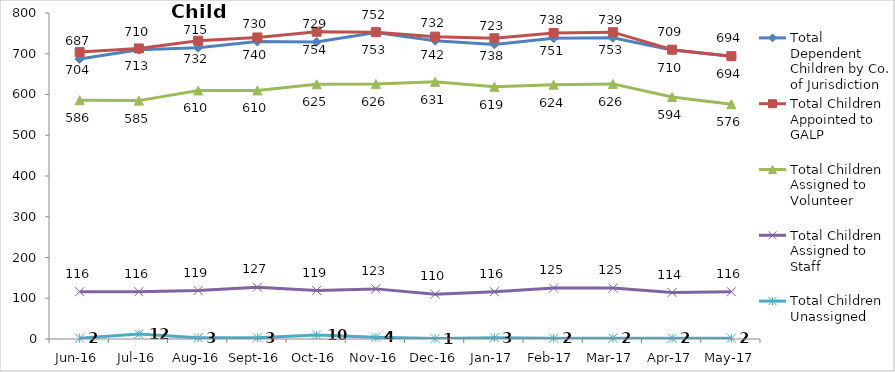
| Category | Total Dependent Children by Co. of Jurisdiction | Total Children Appointed to GALP | Total Children Assigned to Volunteer | Total Children Assigned to Staff | Total Children Unassigned |
|---|---|---|---|---|---|
| Jun-16 | 687 | 704 | 586 | 116 | 2 |
| Jul-16 | 710 | 713 | 585 | 116 | 12 |
| Aug-16 | 715 | 732 | 610 | 119 | 3 |
| Sep-16 | 730 | 740 | 610 | 127 | 3 |
| Oct-16 | 729 | 754 | 625 | 119 | 10 |
| Nov-16 | 752 | 753 | 626 | 123 | 4 |
| Dec-16 | 732 | 742 | 631 | 110 | 1 |
| Jan-17 | 723 | 738 | 619 | 116 | 3 |
| Feb-17 | 738 | 751 | 624 | 125 | 2 |
| Mar-17 | 739 | 753 | 626 | 125 | 2 |
| Apr-17 | 709 | 710 | 594 | 114 | 2 |
| May-17 | 694 | 694 | 576 | 116 | 2 |